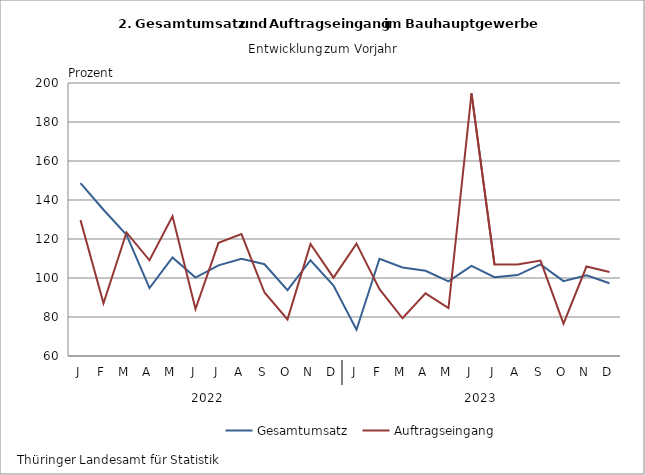
| Category | Gesamtumsatz | Auftragseingang |
|---|---|---|
| J | 148.64 | 129.685 |
| F | 134.99 | 87.034 |
| M | 122.111 | 123.373 |
| A | 94.844 | 109.065 |
| M | 110.531 | 131.683 |
| J | 100.239 | 84.113 |
| J | 106.481 | 118.039 |
| A | 109.845 | 122.495 |
| S | 107.05 | 92.564 |
| O | 93.763 | 78.772 |
| N | 109.115 | 117.453 |
| D | 96.114 | 100.165 |
| J | 73.479 | 117.632 |
| F | 109.881 | 94.312 |
| M | 105.416 | 79.354 |
| A | 103.705 | 92.123 |
| M | 98.261 | 84.547 |
| J | 106.244 | 194.725 |
| J | 100.415 | 106.91 |
| A | 101.501 | 106.952 |
| S | 106.965 | 108.944 |
| O | 98.403 | 76.608 |
| N | 101.379 | 105.881 |
| D | 97.3 | 103.05 |